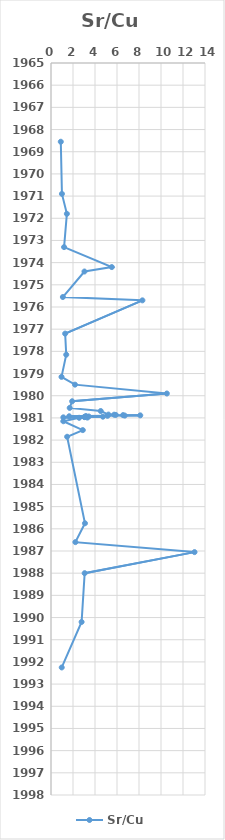
| Category | Sr/Cu |
|---|---|
| 0.8906090842440928 | 1968.55 |
| 0.9945228103474504 | 1970.9 |
| 1.442618711279669 | 1971.8 |
| 1.18891506117652 | 1973.3 |
| 5.52959924959895 | 1974.2 |
| 3.042121447100284 | 1974.4 |
| 1.0782609007874113 | 1975.55 |
| 8.310468344644661 | 1975.7 |
| 1.2868072147941505 | 1977.2 |
| 1.385018980644351 | 1978.15 |
| 0.9561325639789721 | 1979.15 |
| 2.1816712820768527 | 1979.5 |
| 10.531132160841072 | 1979.9 |
| 1.9224950322397922 | 1980.25 |
| 1.6996780496670685 | 1980.55 |
| 4.52168716520871 | 1980.69 |
| 5.227748584044017 | 1980.85 |
| 5.7402511172995165 | 1980.855 |
| 5.890016957302765 | 1980.865 |
| 6.548627639082134 | 1980.875 |
| 8.114605590531061 | 1980.885 |
| 6.70621273369529 | 1980.895 |
| 5.134220366547773 | 1980.905 |
| 3.1707628949281723 | 1980.915 |
| 1.6543538421011013 | 1980.925 |
| 3.435030551893262 | 1980.935 |
| 4.719568258707427 | 1980.945 |
| 3.0271724935856583 | 1980.955 |
| 3.0550346544713736 | 1980.965 |
| 1.1220619960688836 | 1980.975 |
| 3.3064589591667555 | 1980.985 |
| 2.55959790981535 | 1980.995 |
| 1.1220654860655155 | 1981.15 |
| 2.890179632008656 | 1981.55 |
| 1.4671755307371457 | 1981.85 |
| 3.087692674026804 | 1985.75 |
| 2.2171165093599634 | 1986.6 |
| 13.047985276461414 | 1987.05 |
| 3.060837898827936 | 1988 |
| 2.781744340152252 | 1990.2 |
| 0.9765439188917799 | 1992.25 |